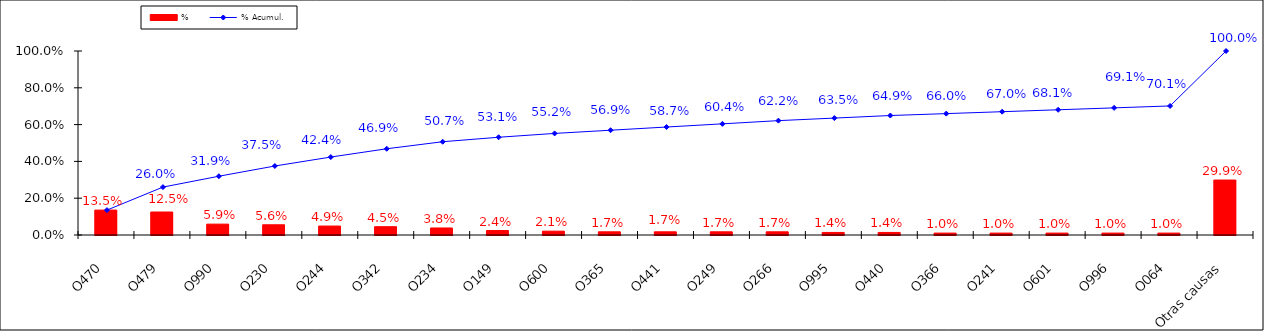
| Category | % |
|---|---|
| O470 | 0.135 |
| O479 | 0.125 |
| O990 | 0.059 |
| O230 | 0.056 |
| O244 | 0.049 |
| O342 | 0.045 |
| O234 | 0.038 |
| O149 | 0.024 |
| O600 | 0.021 |
| O365 | 0.017 |
| O441 | 0.017 |
| O249 | 0.017 |
| O266 | 0.017 |
| O995 | 0.014 |
| O440 | 0.014 |
| O366 | 0.01 |
| O241 | 0.01 |
| O601 | 0.01 |
| O996 | 0.01 |
| O064 | 0.01 |
| Otras causas | 0.299 |